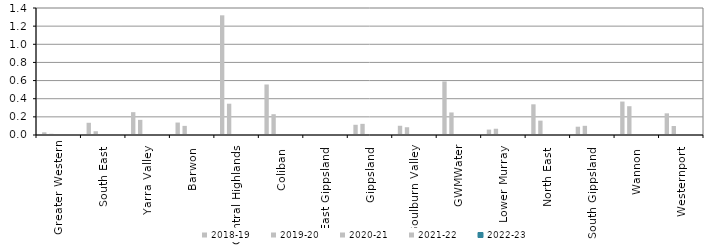
| Category | 2018-19 | 2019-20 | 2020-21 | 2021-22 | 2022-23 |
|---|---|---|---|---|---|
| Greater Western | 0.03 | 0.013 | 0 | 0 | 0 |
| South East  | 0.135 | 0.041 | 0 | 0 | 0 |
| Yarra Valley  | 0.252 | 0.167 | 0 | 0 | 0 |
| Barwon  | 0.137 | 0.101 | 0 | 0 | 0 |
| Central Highlands  | 1.319 | 0.345 | 0 | 0 | 0 |
| Coliban  | 0.557 | 0.229 | 0 | 0 | 0 |
| East Gippsland  | 0 | 0.005 | 0 | 0 | 0 |
| Gippsland  | 0.113 | 0.123 | 0 | 0 | 0 |
| Goulburn Valley  | 0.102 | 0.085 | 0 | 0 | 0 |
| GWMWater | 0.591 | 0.248 | 0 | 0 | 0 |
| Lower Murray  | 0.06 | 0.069 | 0 | 0 | 0 |
| North East  | 0.338 | 0.158 | 0 | 0 | 0 |
| South Gippsland  | 0.091 | 0.101 | 0 | 0 | 0 |
| Wannon  | 0.369 | 0.317 | 0 | 0 | 0 |
| Westernport  | 0.239 | 0.099 | 0 | 0 | 0 |